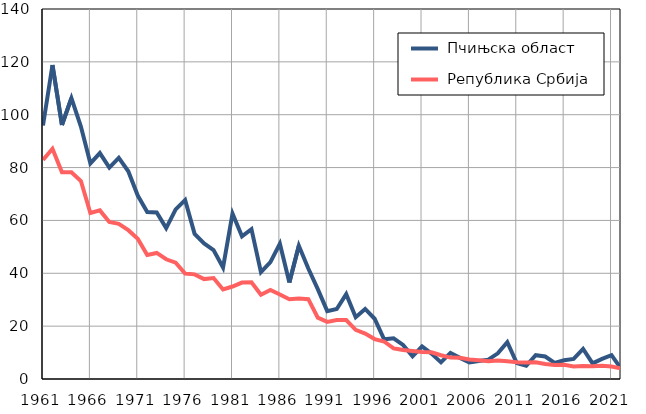
| Category |  Пчињска област |  Република Србија |
|---|---|---|
| 1961.0 | 95.9 | 82.9 |
| 1962.0 | 118.8 | 87.1 |
| 1963.0 | 96.1 | 78.2 |
| 1964.0 | 106.3 | 78.2 |
| 1965.0 | 95.5 | 74.9 |
| 1966.0 | 81.6 | 62.8 |
| 1967.0 | 85.5 | 63.8 |
| 1968.0 | 80 | 59.4 |
| 1969.0 | 83.7 | 58.7 |
| 1970.0 | 78.6 | 56.3 |
| 1971.0 | 69.4 | 53.1 |
| 1972.0 | 63.2 | 46.9 |
| 1973.0 | 63 | 47.7 |
| 1974.0 | 57.1 | 45.3 |
| 1975.0 | 64.2 | 44 |
| 1976.0 | 67.7 | 39.9 |
| 1977.0 | 54.9 | 39.6 |
| 1978.0 | 51.3 | 37.8 |
| 1979.0 | 48.8 | 38.2 |
| 1980.0 | 42.2 | 33.9 |
| 1981.0 | 62.6 | 35 |
| 1982.0 | 54 | 36.5 |
| 1983.0 | 56.7 | 36.6 |
| 1984.0 | 40.4 | 31.9 |
| 1985.0 | 44.2 | 33.7 |
| 1986.0 | 51.2 | 32 |
| 1987.0 | 36.5 | 30.2 |
| 1988.0 | 50.4 | 30.5 |
| 1989.0 | 41.8 | 30.2 |
| 1990.0 | 34 | 23.2 |
| 1991.0 | 25.7 | 21.6 |
| 1992.0 | 26.5 | 22.3 |
| 1993.0 | 32.1 | 22.3 |
| 1994.0 | 23.4 | 18.6 |
| 1995.0 | 26.5 | 17.2 |
| 1996.0 | 22.8 | 15.1 |
| 1997.0 | 15 | 14.2 |
| 1998.0 | 15.4 | 11.6 |
| 1999.0 | 12.9 | 11 |
| 2000.0 | 8.6 | 10.6 |
| 2001.0 | 12.3 | 10.2 |
| 2002.0 | 9.6 | 10.1 |
| 2003.0 | 6.3 | 9 |
| 2004.0 | 9.9 | 8.1 |
| 2005.0 | 8 | 8 |
| 2006.0 | 6.3 | 7.4 |
| 2007.0 | 6.8 | 7.1 |
| 2008.0 | 7.3 | 6.7 |
| 2009.0 | 9.7 | 7 |
| 2010.0 | 13.9 | 6.7 |
| 2011.0 | 6 | 6.3 |
| 2012.0 | 5 | 6.2 |
| 2013.0 | 9 | 6.3 |
| 2014.0 | 8.5 | 5.7 |
| 2015.0 | 6.1 | 5.3 |
| 2016.0 | 7.1 | 5.4 |
| 2017.0 | 7.6 | 4.7 |
| 2018.0 | 11.4 | 4.9 |
| 2019.0 | 5.9 | 4.8 |
| 2020.0 | 7.6 | 5 |
| 2021.0 | 9 | 4.7 |
| 2022.0 | 3.9 | 4 |